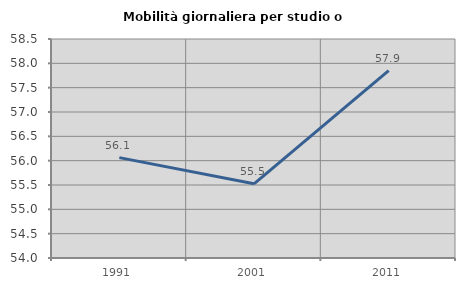
| Category | Mobilità giornaliera per studio o lavoro |
|---|---|
| 1991.0 | 56.063 |
| 2001.0 | 55.524 |
| 2011.0 | 57.85 |